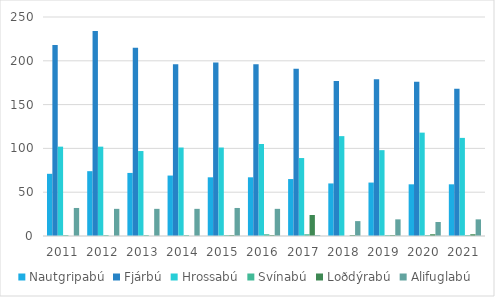
| Category | Nautgripabú | Fjárbú | Hrossabú | Svínabú | Loðdýrabú | Alifuglabú |
|---|---|---|---|---|---|---|
| 2011.0 | 71 | 218 | 102 | 1 | 0 | 32 |
| 2012.0 | 74 | 234 | 102 | 1 | 0 | 31 |
| 2013.0 | 72 | 215 | 97 | 1 | 0 | 31 |
| 2014.0 | 69 | 196 | 101 | 1 | 0 | 31 |
| 2015.0 | 67 | 198 | 101 | 1 | 1 | 32 |
| 2016.0 | 67 | 196 | 105 | 2 | 1 | 31 |
| 2017.0 | 65 | 191 | 89 | 2 | 24 | 1 |
| 2018.0 | 60 | 177 | 114 | 0 | 1 | 17 |
| 2019.0 | 61 | 179 | 98 | 1 | 1 | 19 |
| 2020.0 | 59 | 176 | 118 | 1 | 2 | 16 |
| 2021.0 | 59 | 168 | 112 | 1 | 2 | 19 |